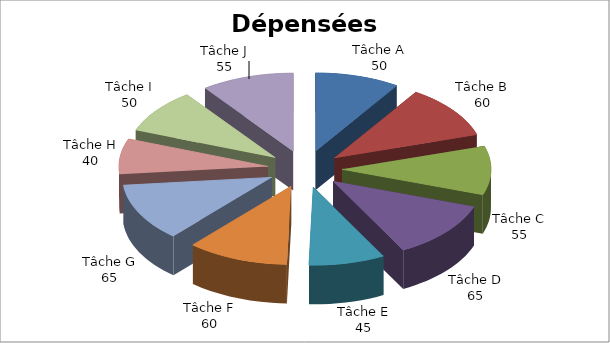
| Category | Dépensées (H) |
|---|---|
| Tâche A | 50 |
| Tâche B | 60 |
| Tâche C | 55 |
| Tâche D | 65 |
| Tâche E | 45 |
| Tâche F | 60 |
| Tâche G | 65 |
| Tâche H | 40 |
| Tâche I | 50 |
| Tâche J | 55 |